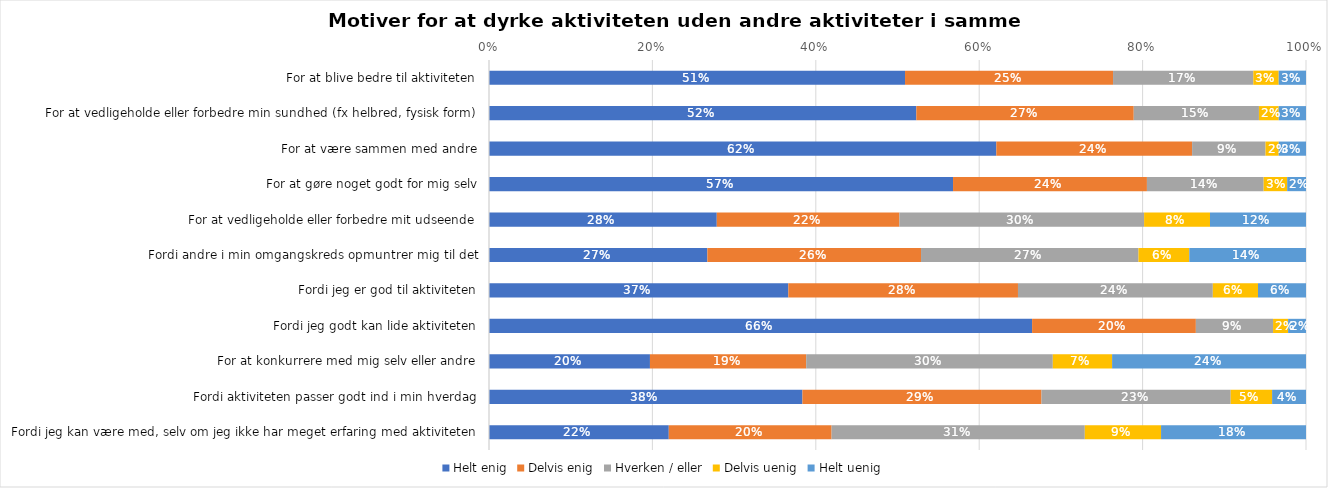
| Category | Helt enig | Delvis enig | Hverken / eller | Delvis uenig | Helt uenig |
|---|---|---|---|---|---|
| For at blive bedre til aktiviteten | 0.509 | 0.255 | 0.172 | 0.031 | 0.033 |
| For at vedligeholde eller forbedre min sundhed (fx helbred, fysisk form) | 0.523 | 0.266 | 0.153 | 0.024 | 0.033 |
| For at være sammen med andre | 0.621 | 0.24 | 0.09 | 0.016 | 0.033 |
| For at gøre noget godt for mig selv | 0.568 | 0.237 | 0.143 | 0.029 | 0.023 |
| For at vedligeholde eller forbedre mit udseende | 0.279 | 0.224 | 0.3 | 0.081 | 0.118 |
| Fordi andre i min omgangskreds opmuntrer mig til det | 0.267 | 0.262 | 0.266 | 0.062 | 0.143 |
| Fordi jeg er god til aktiviteten | 0.366 | 0.281 | 0.238 | 0.055 | 0.059 |
| Fordi jeg godt kan lide aktiviteten | 0.665 | 0.2 | 0.094 | 0.018 | 0.022 |
| For at konkurrere med mig selv eller andre | 0.197 | 0.191 | 0.302 | 0.073 | 0.237 |
| Fordi aktiviteten passer godt ind i min hverdag | 0.384 | 0.293 | 0.232 | 0.051 | 0.041 |
| Fordi jeg kan være med, selv om jeg ikke har meget erfaring med aktiviteten | 0.22 | 0.199 | 0.31 | 0.093 | 0.177 |